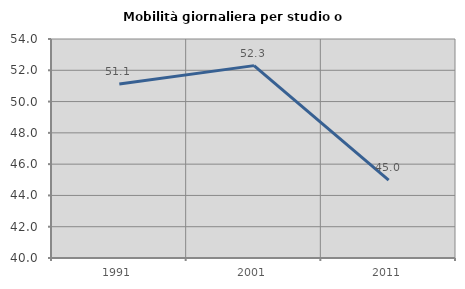
| Category | Mobilità giornaliera per studio o lavoro |
|---|---|
| 1991.0 | 51.123 |
| 2001.0 | 52.298 |
| 2011.0 | 44.976 |